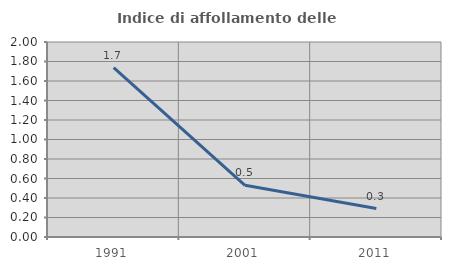
| Category | Indice di affollamento delle abitazioni  |
|---|---|
| 1991.0 | 1.737 |
| 2001.0 | 0.53 |
| 2011.0 | 0.292 |